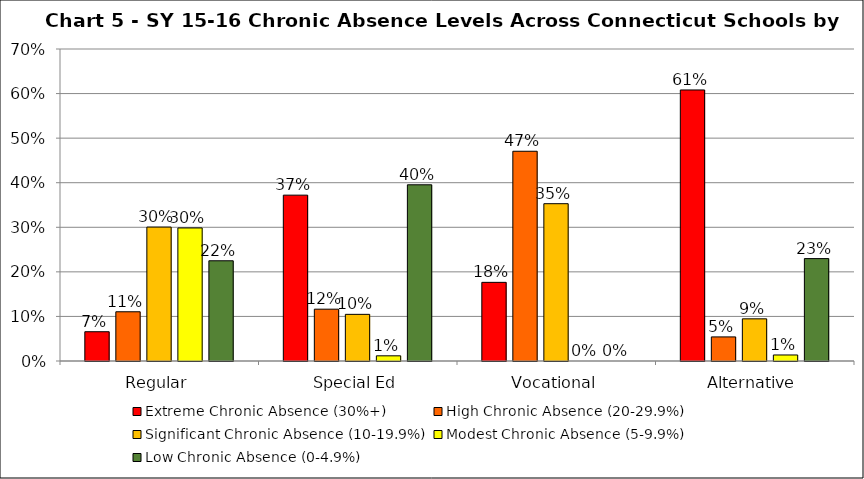
| Category | Extreme Chronic Absence (30%+) | High Chronic Absence (20-29.9%) | Significant Chronic Absence (10-19.9%) | Modest Chronic Absence (5-9.9%) | Low Chronic Absence (0-4.9%) |
|---|---|---|---|---|---|
| 0 | 0.066 | 0.11 | 0.3 | 0.299 | 0.225 |
| 1 | 0.372 | 0.116 | 0.105 | 0.012 | 0.395 |
| 2 | 0.176 | 0.471 | 0.353 | 0 | 0 |
| 3 | 0.608 | 0.054 | 0.095 | 0.014 | 0.23 |